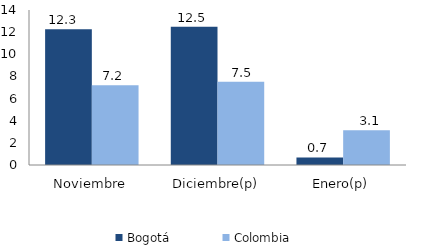
| Category | Bogotá | Colombia |
|---|---|---|
| Noviembre | 12.271 | 7.212 |
| Diciembre(p) | 12.49 | 7.517 |
| Enero(p) | 0.68 | 3.142 |